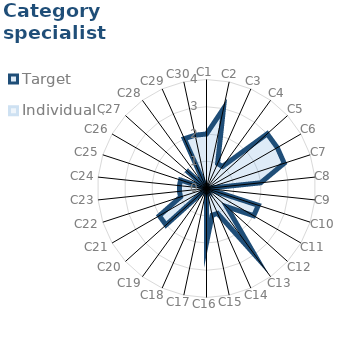
| Category | Target | Individual 3 |
|---|---|---|
| C1 | 2 | 0 |
| C2 | 3 | 0 |
| C3 | 1 | 0 |
| C4 | 1 | 0 |
| C5 | 3 | 0 |
| C6 | 3 | 0 |
| C7 | 3 | 0 |
| C8 | 2 | 0 |
| C9 | 0 | 0 |
| C10 | 2 | 0 |
| C11 | 2 | 0 |
| C12 | 1 | 0 |
| C13 | 3 | 0 |
| C14 | 1 | 0 |
| C15 | 1 | 0 |
| C16 | 2 | 0 |
| C17 | 0 | 0 |
| C18 | 0 | 0 |
| C19 | 0 | 0 |
| C20 | 2 | 0 |
| C21 | 2 | 0 |
| C22 | 1 | 0 |
| C23 | 1 | 0 |
| C24 | 1 | 0 |
| C25 | 1 | 0 |
| C26 | 0 | 0 |
| C27 | 1 | 0 |
| C28 | 0 | 0 |
| C29 | 2 | 0 |
| C30 | 2 | 0 |